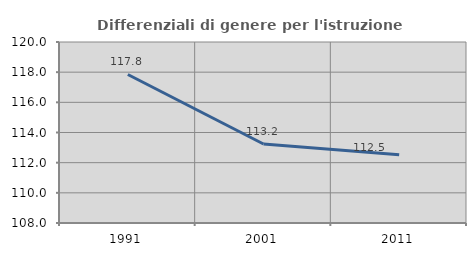
| Category | Differenziali di genere per l'istruzione superiore |
|---|---|
| 1991.0 | 117.847 |
| 2001.0 | 113.235 |
| 2011.0 | 112.531 |